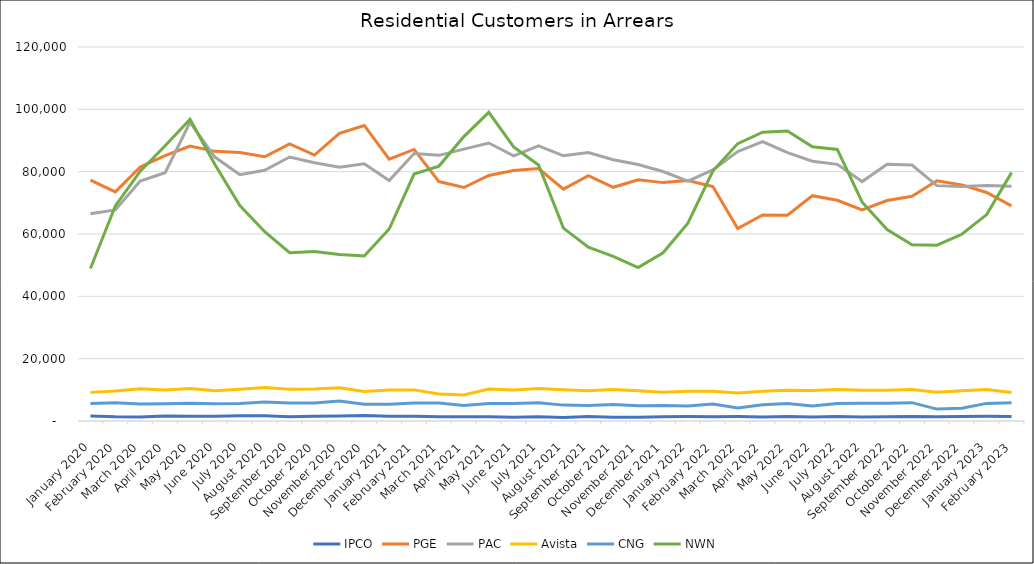
| Category | IPCO | PGE | PAC | Avista | CNG | NWN |
|---|---|---|---|---|---|---|
| 2020-01-01 | 1638 | 77298 | 66520 | 9184 | 5588 | 48916 |
| 2020-02-01 | 1344 | 73512 | 67710 | 9592 | 5867 | 69011 |
| 2020-03-01 | 1308 | 81500 | 76985 | 10359 | 5456 | 80181 |
| 2020-04-01 | 1585 | 85177 | 79643 | 9948 | 5569 | 88304 |
| 2020-05-01 | 1547 | 88215 | 95802 | 10421 | 5726 | 96776 |
| 2020-06-01 | 1493 | 86518 | 84677 | 9707 | 5548 | 82328 |
| 2020-07-01 | 1690 | 86136 | 79053 | 10155 | 5630 | 69143 |
| 2020-08-01 | 1692 | 84777 | 80470 | 10719 | 6103 | 60738 |
| 2020-09-01 | 1402 | 88912 | 84717 | 10178 | 5773 | 53990 |
| 2020-10-01 | 1551 | 85318 | 82844 | 10296 | 5743 | 54415 |
| 2020-11-01 | 1631 | 92277 | 81436 | 10701 | 6378 | 53440 |
| 2020-12-01 | 1784 | 94828 | 82558 | 9440 | 5414 | 52918 |
| 2021-01-01 | 1533 | 83988 | 77160 | 9930 | 5385 | 61603 |
| 2021-02-01 | 1485 | 87131 | 85805 | 9984 | 5804 | 79231 |
| 2021-03-01 | 1381 | 76823 | 85240 | 8684 | 5793 | 81792 |
| 2021-04-01 | 1335 | 74914 | 87241 | 8327 | 4937 | 91240 |
| 2021-05-01 | 1402 | 78780 | 89205 | 10243 | 5602 | 99013 |
| 2021-06-01 | 1185 | 80388 | 85098 | 9929 | 5583 | 87953 |
| 2021-07-01 | 1394 | 80977 | 88310 | 10441 | 5833 | 82120 |
| 2021-08-01 | 1138 | 74398 | 85098 | 9996 | 5094 | 61899 |
| 2021-09-01 | 1465 | 78716 | 86130 | 9709 | 4936 | 55772 |
| 2021-10-01 | 1230 | 74990 | 83822 | 10143 | 5293 | 52823 |
| 2021-11-01 | 1238 | 77406 | 82289 | 9737 | 4856 | 49241 |
| 2021-12-01 | 1394 | 76487 | 80047 | 9229 | 4999 | 53969 |
| 2022-01-01 | 1428 | 77184 | 76932 | 9541 | 4810 | 63453 |
| 2022-02-01 | 1332 | 75250 | 80561 | 9534 | 5445 | 80213 |
| 2022-03-01 | 1409 | 61773 | 86476 | 9008 | 4170 | 89001 |
| 2022-04-01 | 1317 | 66090 | 89666 | 9563 | 5231 | 92652 |
| 2022-05-01 | 1477 | 66021 | 86125 | 9838 | 5643 | 93054 |
| 2022-06-01 | 1289 | 72297 | 83351 | 9754 | 4828 | 88000 |
| 2022-07-01 | 1433 | 70832 | 82343 | 10139 | 5650 | 87138 |
| 2022-08-01 | 1275 | 67722 | 76820 | 9852 | 5692 | 70183 |
| 2022-09-01 | 1324 | 70725 | 82343 | 9868 | 5714 | 61409 |
| 2022-10-01 | 1468 | 72087 | 82109 | 10077 | 5890 | 56517 |
| 2022-11-01 | 1382 | 77056 | 75521 | 9200 | 3813 | 56414 |
| 2022-12-01 | 1447 | 75770 | 75226 | 9736 | 4121 | 59914 |
| 2023-01-01 | 1502 | 73325 | 75552 | 10107 | 5651 | 66229 |
| 2023-02-01 | 1433 | 69045 | 75358 | 9124 | 5884 | 79694 |